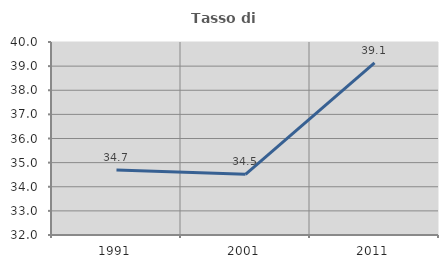
| Category | Tasso di occupazione   |
|---|---|
| 1991.0 | 34.698 |
| 2001.0 | 34.517 |
| 2011.0 | 39.131 |